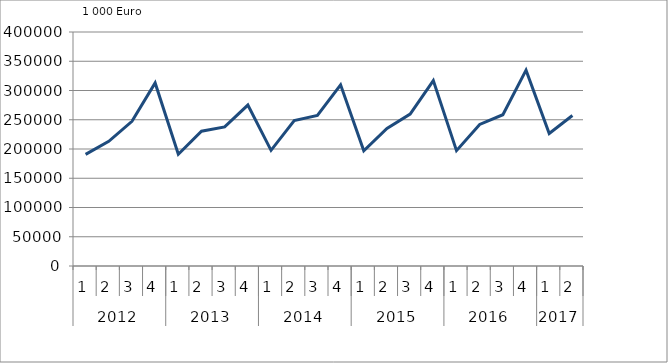
| Category | Ausbaugewerblicher Umsatz3 |
|---|---|
| 0 | 190755 |
| 1 | 213167 |
| 2 | 247277 |
| 3 | 312946 |
| 4 | 191088.978 |
| 5 | 230353.875 |
| 6 | 237735.574 |
| 7 | 275098.219 |
| 8 | 197732.754 |
| 9 | 248690.349 |
| 10 | 257339.084 |
| 11 | 309632.186 |
| 12 | 197030.42 |
| 13 | 235094.994 |
| 14 | 259758.438 |
| 15 | 316833.232 |
| 16 | 197219.532 |
| 17 | 242069.899 |
| 18 | 258547.84 |
| 19 | 334764.305 |
| 20 | 226552.317 |
| 21 | 257191.13 |